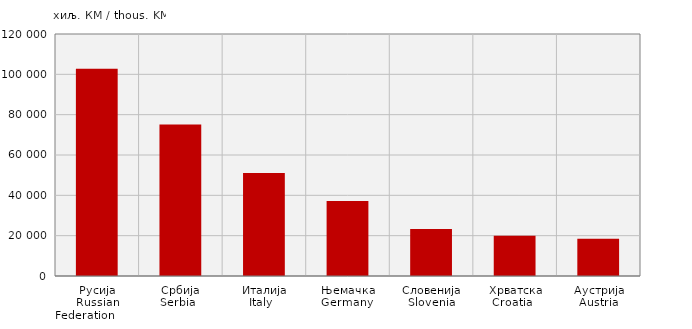
| Category | Увоз
Import |
|---|---|
| Русија
Russian Federation            | 102772 |
| Србија
Serbia   | 75185 |
| Италија
Italy   | 51032 |
| Њемачка
Germany  | 37243 |
| Словенија
Slovenia | 23307 |
| Хрватска
Croatia   | 19968 |
| Аустрија
Austria | 18446 |